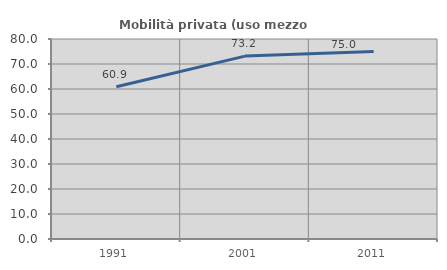
| Category | Mobilità privata (uso mezzo privato) |
|---|---|
| 1991.0 | 60.887 |
| 2001.0 | 73.156 |
| 2011.0 | 74.953 |